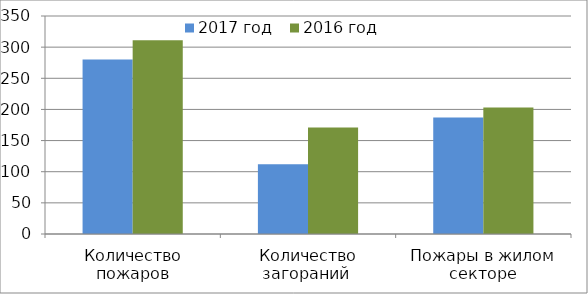
| Category | 2017 год | 2016 год |
|---|---|---|
| Количество пожаров | 280 | 311 |
| Количество загораний  | 112 | 171 |
| Пожары в жилом секторе | 187 | 203 |